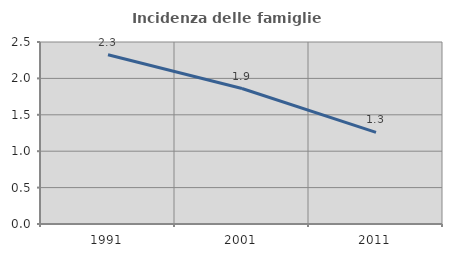
| Category | Incidenza delle famiglie numerose |
|---|---|
| 1991.0 | 2.326 |
| 2001.0 | 1.861 |
| 2011.0 | 1.259 |